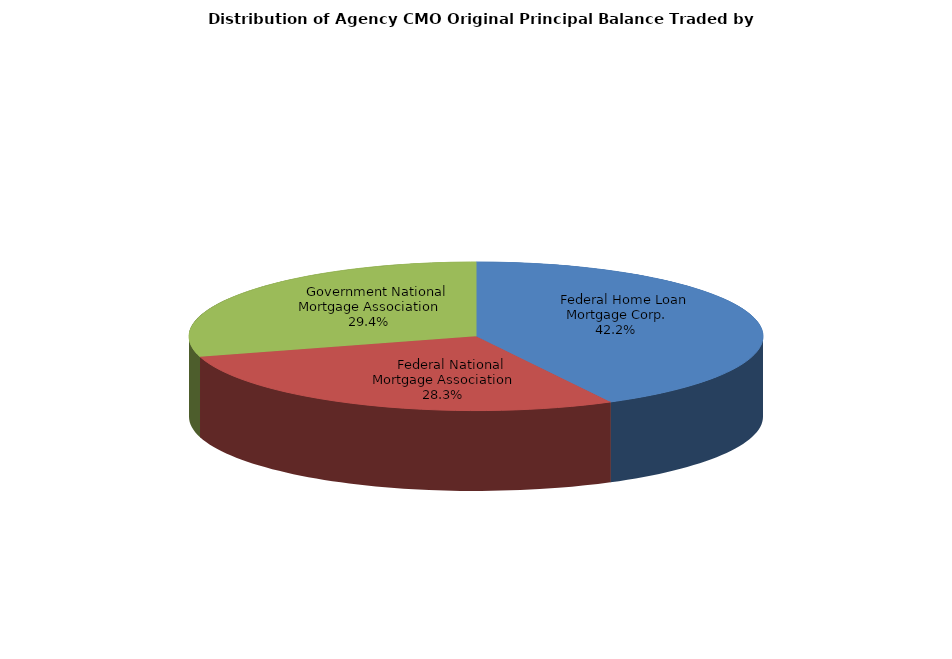
| Category | Series 0 |
|---|---|
|     Federal Home Loan Mortgage Corp. | 3831976703.844 |
|     Federal National Mortgage Association | 2570473162.068 |
|     Government National Mortgage Association | 2670407475.515 |